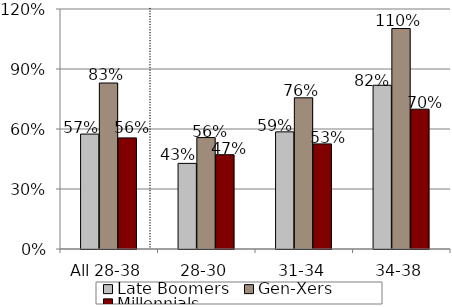
| Category | Late Boomers | Gen-Xers | Millennials |
|---|---|---|---|
| All 28-38 | 0.575 | 0.83 | 0.556 |
| 28-30 | 0.428 | 0.557 | 0.472 |
| 31-34 | 0.586 | 0.756 | 0.525 |
| 34-38 | 0.819 | 1.102 | 0.699 |